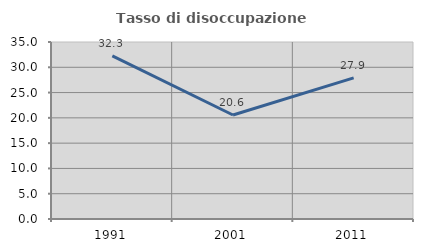
| Category | Tasso di disoccupazione giovanile  |
|---|---|
| 1991.0 | 32.258 |
| 2001.0 | 20.561 |
| 2011.0 | 27.907 |